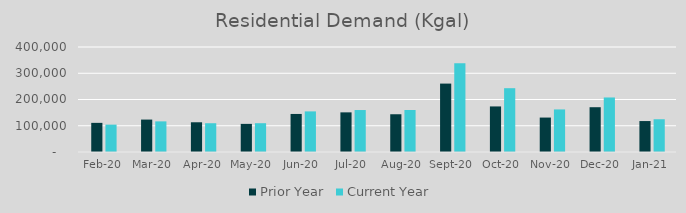
| Category | Prior Year | Current Year |
|---|---|---|
| 2020-02-01 | 111009.962 | 104204.224 |
| 2020-03-01 | 123525.131 | 116687.491 |
| 2020-04-01 | 113258.787 | 109598.965 |
| 2020-05-01 | 107128.051 | 109656.015 |
| 2020-06-01 | 144930.453 | 154696.236 |
| 2020-07-01 | 151028.014 | 159889.353 |
| 2020-08-01 | 143816.337 | 160013.985 |
| 2020-09-01 | 260607.456 | 337995.641 |
| 2020-10-01 | 173601.368 | 243049.084 |
| 2020-11-01 | 131198.833 | 162175.563 |
| 2020-12-01 | 170629.384 | 207737.904 |
| 2021-01-01 | 117899.625 | 124779.797 |